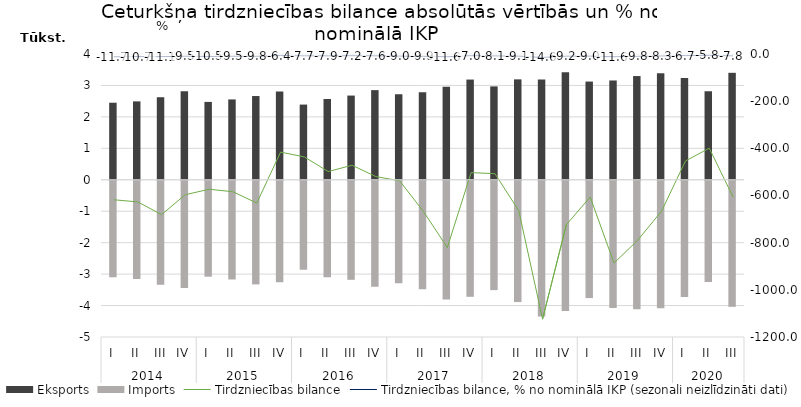
| Category | Eksports | Imports |
|---|---|---|
| 0 | 2450.7 | -3068.8 |
| 1 | 2493.4 | -3120.5 |
| 2 | 2625.5 | -3306.5 |
| 3 | 2816.7 | -3413.2 |
| 4 | 2476.5 | -3050.1 |
| 5 | 2555.2 | -3139.2 |
| 6 | 2663.4 | -3295.5 |
| 7 | 2809.5 | -3225.4 |
| 8 | 2391.5 | -2828.1 |
| 9 | 2569.5 | -3068 |
| 10 | 2678.2 | -3149.9 |
| 11 | 2850.8 | -3370.5 |
| 12 | 2719.6 | -3257.4 |
| 13 | 2783.8 | -3452 |
| 14 | 2956.9 | -3777.4 |
| 15 | 3187 | -3690 |
| 16 | 2969.9 | -3477.4 |
| 17 | 3193.3 | -3857.4 |
| 18 | 3189.7 | -4313.9 |
| 19 | 3420.5 | -4144.2 |
| 20 | 3123.6 | -3730.2 |
| 21 | 3158.2 | -4044.8 |
| 22 | 3298.5 | -4087.5 |
| 23 | 3385.3 | -4051.1 |
| 24 | 3239 | -3692.6 |
| 25 | 2818 | -3217.4 |
| 26 | 3401.8 | -4008.6 |